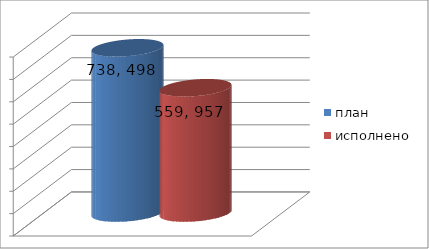
| Category | план | исполнено |
|---|---|---|
| 0 | 738498575.66 | 559957502.96 |